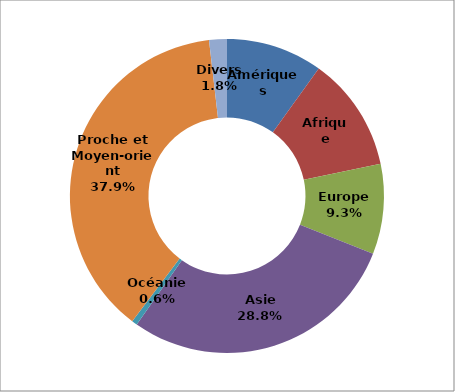
| Category | Series 0 |
|---|---|
| Amériques | 683 |
| Afrique | 808.4 |
| Europe | 638.7 |
| Asie | 1977.1 |
| Océanie | 38.7 |
| Proche et Moyen-orient | 2602.3 |
| Divers | 125.8 |